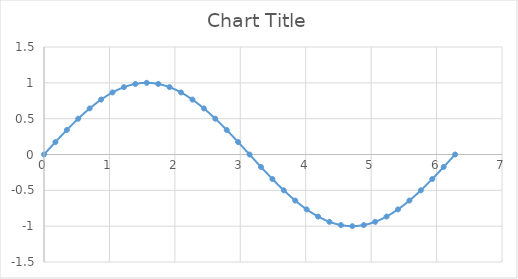
| Category | Series 0 |
|---|---|
| 0.0 | 0 |
| 0.1745327777777778 | 0.174 |
| 0.3490655555555556 | 0.342 |
| 0.5235983333333333 | 0.5 |
| 0.6981311111111111 | 0.643 |
| 0.8726638888888889 | 0.766 |
| 1.0471966666666666 | 0.866 |
| 1.2217294444444444 | 0.94 |
| 1.3962622222222223 | 0.985 |
| 1.570795 | 1 |
| 1.7453277777777778 | 0.985 |
| 1.9198605555555557 | 0.94 |
| 2.094393333333333 | 0.866 |
| 2.268926111111111 | 0.766 |
| 2.443458888888889 | 0.643 |
| 2.6179916666666667 | 0.5 |
| 2.7925244444444446 | 0.342 |
| 2.967057222222222 | 0.174 |
| 3.14159 | 0 |
| 3.3161227777777778 | -0.174 |
| 3.4906555555555556 | -0.342 |
| 3.665188333333333 | -0.5 |
| 3.8397211111111114 | -0.643 |
| 4.014253888888889 | -0.766 |
| 4.188786666666666 | -0.866 |
| 4.363319444444444 | -0.94 |
| 4.537852222222222 | -0.985 |
| 4.712384999999999 | -1 |
| 4.886917777777778 | -0.985 |
| 5.061450555555556 | -0.94 |
| 5.235983333333333 | -0.866 |
| 5.410516111111111 | -0.766 |
| 5.585048888888889 | -0.643 |
| 5.759581666666667 | -0.5 |
| 5.934114444444444 | -0.342 |
| 6.1086472222222215 | -0.174 |
| 6.28318 | 0 |